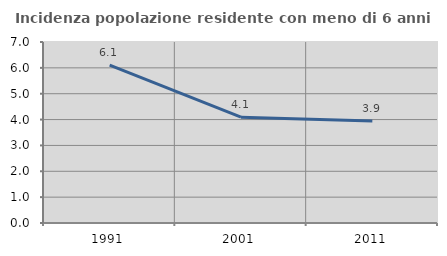
| Category | Incidenza popolazione residente con meno di 6 anni |
|---|---|
| 1991.0 | 6.109 |
| 2001.0 | 4.092 |
| 2011.0 | 3.944 |